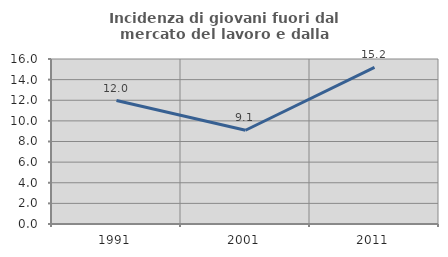
| Category | Incidenza di giovani fuori dal mercato del lavoro e dalla formazione  |
|---|---|
| 1991.0 | 11.972 |
| 2001.0 | 9.091 |
| 2011.0 | 15.19 |